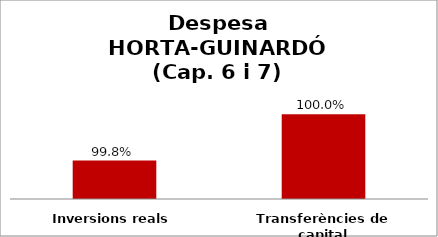
| Category | Series 0 |
|---|---|
| Inversions reals | 0.998 |
| Transferències de capital | 1 |